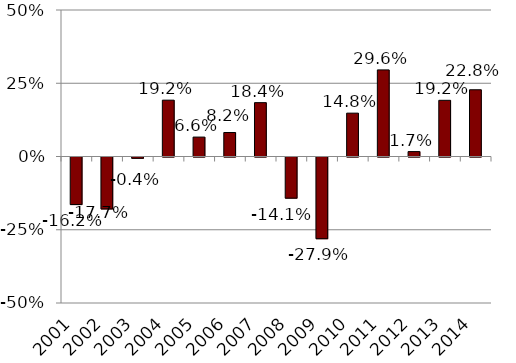
| Category | Series 1 |
|---|---|
| 2001.0 | -0.162 |
| 2002.0 | -0.177 |
| 2003.0 | -0.004 |
| 2004.0 | 0.192 |
| 2005.0 | 0.066 |
| 2006.0 | 0.082 |
| 2007.0 | 0.184 |
| 2008.0 | -0.141 |
| 2009.0 | -0.279 |
| 2010.0 | 0.148 |
| 2011.0 | 0.296 |
| 2012.0 | 0.017 |
| 2013.0 | 0.192 |
| 2014.0 | 0.228 |